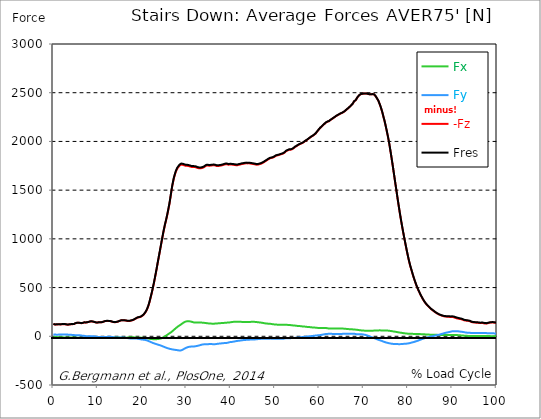
| Category |  Fx |  Fy |  -Fz |  Fres |
|---|---|---|---|---|
| 0.0 | -7.399 | 18.491 | 125.871 | 127.527 |
| 0.167348456675344 | -7.666 | 18.652 | 123.173 | 124.894 |
| 0.334696913350688 | -7.69 | 17.957 | 120.443 | 122.099 |
| 0.5020453700260321 | -7.634 | 16.802 | 119.126 | 120.645 |
| 0.669393826701376 | -8.07 | 16.592 | 120.847 | 122.357 |
| 0.83674228337672 | -8.45 | 16.576 | 121.953 | 123.48 |
| 1.0040907400520642 | -8.74 | 16.851 | 122.212 | 123.787 |
| 1.1621420602454444 | -9.055 | 17.182 | 122.349 | 123.981 |
| 1.3294905169207885 | -9.338 | 17.432 | 122.26 | 123.933 |
| 1.4968389735961325 | -9.589 | 17.578 | 122.067 | 123.771 |
| 1.6641874302714765 | -9.791 | 17.545 | 122.147 | 123.836 |
| 1.8315358869468206 | -10.049 | 17.691 | 122.777 | 124.482 |
| 1.9988843436221646 | -10.348 | 17.933 | 123.585 | 125.338 |
| 2.1662328002975086 | -10.768 | 18.442 | 124.118 | 125.976 |
| 2.333581256972853 | -11.293 | 18.935 | 124.353 | 126.332 |
| 2.5009297136481967 | -11.729 | 19.258 | 123.892 | 125.976 |
| 2.6682781703235405 | -11.867 | 19.088 | 123.311 | 125.395 |
| 2.8356266269988843 | -11.915 | 18.83 | 121.711 | 123.795 |
| 3.002975083674229 | -11.939 | 18.555 | 119.902 | 121.986 |
| 3.1703235403495724 | -11.858 | 17.553 | 119.352 | 121.291 |
| 3.337671997024917 | -11.834 | 16.649 | 119.086 | 120.919 |
| 3.4957233172182973 | -11.98 | 15.922 | 120.596 | 122.341 |
| 3.663071773893641 | -12.157 | 15.582 | 121.905 | 123.617 |
| 3.8304202305689854 | -12.295 | 15.235 | 122.697 | 124.369 |
| 3.997768687244329 | -12.416 | 14.807 | 123.278 | 124.886 |
| 4.165117143919673 | -12.537 | 14.379 | 123.9 | 125.443 |
| 4.332465600595017 | -12.634 | 13.838 | 124.474 | 125.936 |
| 4.499814057270361 | -12.682 | 12.981 | 124.805 | 126.154 |
| 4.667162513945706 | -12.707 | 12.085 | 125.661 | 126.905 |
| 4.834510970621049 | -12.909 | 11.479 | 129.805 | 130.993 |
| 5.001859427296393 | -13.409 | 11.527 | 133.747 | 134.943 |
| 5.169207883971737 | -13.935 | 11.762 | 135.791 | 137.051 |
| 5.336556340647081 | -14.338 | 11.616 | 137.738 | 139.006 |
| 5.503904797322425 | -14.758 | 11.39 | 138.78 | 140.064 |
| 5.671253253997769 | -15.09 | 11.043 | 138.796 | 140.089 |
| 5.82930457419115 | -15.324 | 10.582 | 137.835 | 139.127 |
| 5.996653030866494 | -15.469 | 9.976 | 136.558 | 137.827 |
| 6.164001487541838 | -15.429 | 8.894 | 135.476 | 136.688 |
| 6.331349944217181 | -15.275 | 7.601 | 134.143 | 135.266 |
| 6.498698400892526 | -15.235 | 6.487 | 135.516 | 136.575 |
| 6.66604685756787 | -15.227 | 5.412 | 137.471 | 138.481 |
| 6.833395314243213 | -15.38 | 4.629 | 139.838 | 140.816 |
| 7.000743770918558 | -15.825 | 4.354 | 142.439 | 143.433 |
| 7.168092227593902 | -15.696 | 3.07 | 141.938 | 142.883 |
| 7.335440684269246 | -15.308 | 1.252 | 141.446 | 142.318 |
| 7.50278914094459 | -14.977 | -0.347 | 141.656 | 142.472 |
| 7.6701375976199335 | -14.92 | -1.115 | 143.95 | 144.75 |
| 7.837486054295278 | -15.332 | -0.864 | 146.688 | 147.52 |
| 7.995537374488658 | -15.744 | -0.654 | 147.884 | 148.748 |
| 8.162885831164003 | -16.229 | -0.412 | 149.669 | 150.574 |
| 8.330234287839346 | -16.73 | -0.202 | 152.181 | 153.126 |
| 8.49758274451469 | -17.133 | -0.121 | 152.553 | 153.53 |
| 8.664931201190035 | -17.521 | 0.089 | 152.521 | 153.538 |
| 8.832279657865378 | -17.61 | -0.024 | 151.567 | 152.609 |
| 8.999628114540721 | -17.489 | -0.275 | 150.016 | 151.058 |
| 9.166976571216066 | -17.198 | -0.63 | 147.932 | 148.958 |
| 9.334325027891412 | -16.471 | -1.422 | 145.323 | 146.3 |
| 9.501673484566755 | -15.461 | -2.577 | 142.698 | 143.602 |
| 9.669021941242098 | -14.443 | -3.902 | 140.945 | 141.801 |
| 9.836370397917442 | -13.409 | -5.065 | 140.387 | 141.187 |
| 10.003718854592787 | -12.553 | -5.962 | 141.098 | 141.85 |
| 10.17106731126813 | -11.939 | -6.656 | 142.14 | 142.859 |
| 10.329118631461512 | -11.778 | -6.81 | 144.338 | 145.032 |
| 10.496467088136853 | -12.182 | -6.147 | 145.153 | 145.856 |
| 10.663815544812199 | -12.125 | -6.438 | 144.354 | 145.073 |
| 10.831164001487544 | -11.77 | -7.44 | 143.611 | 144.354 |
| 10.998512458162887 | -11.608 | -8.03 | 144.677 | 145.444 |
| 11.16586091483823 | -11.673 | -8.215 | 147.141 | 147.908 |
| 11.333209371513574 | -12.036 | -7.965 | 150.186 | 150.945 |
| 11.50055782818892 | -12.44 | -7.698 | 153.005 | 153.765 |
| 11.667906284864264 | -13.102 | -7.125 | 155.55 | 156.325 |
| 11.835254741539607 | -13.757 | -6.592 | 157.173 | 157.965 |
| 12.00260319821495 | -14.322 | -6.204 | 157.723 | 158.547 |
| 12.169951654890292 | -14.847 | -5.889 | 158.143 | 158.999 |
| 12.337300111565641 | -15.179 | -5.792 | 157.771 | 158.652 |
| 12.504648568240984 | -15.364 | -5.84 | 157.012 | 157.925 |
| 12.662699888434362 | -15.526 | -5.848 | 156.333 | 157.262 |
| 12.830048345109708 | -15.663 | -5.865 | 155.631 | 156.568 |
| 12.997396801785053 | -15.38 | -6.333 | 154.015 | 154.952 |
| 13.164745258460396 | -14.96 | -7.044 | 151.438 | 152.391 |
| 13.33209371513574 | -14.379 | -8.094 | 148.514 | 149.491 |
| 13.499442171811083 | -13.611 | -9.354 | 146.414 | 147.423 |
| 13.666790628486426 | -12.796 | -10.461 | 145.032 | 146.066 |
| 13.834139085161771 | -12.141 | -11.438 | 144.394 | 145.452 |
| 14.001487541837117 | -11.794 | -12.287 | 144.992 | 146.074 |
| 14.16883599851246 | -11.584 | -13.03 | 145.985 | 147.1 |
| 14.336184455187803 | -11.64 | -13.482 | 147.561 | 148.7 |
| 14.503532911863147 | -11.899 | -13.757 | 149.669 | 150.832 |
| 14.670881368538492 | -12.343 | -13.781 | 152.319 | 153.49 |
| 14.828932688731873 | -12.909 | -13.579 | 155.534 | 156.705 |
| 14.996281145407215 | -13.725 | -13.288 | 158.676 | 159.863 |
| 15.163629602082558 | -14.637 | -13.038 | 161.786 | 162.998 |
| 15.330978058757903 | -15.3 | -12.909 | 163.919 | 165.163 |
| 15.498326515433247 | -15.865 | -12.949 | 164.638 | 165.93 |
| 15.665674972108594 | -16.035 | -13.094 | 164.444 | 165.777 |
| 15.833023428783937 | -16.027 | -13.377 | 164.436 | 165.785 |
| 16.00037188545928 | -15.938 | -13.789 | 163.846 | 165.219 |
| 16.167720342134626 | -15.599 | -14.516 | 162.666 | 164.088 |
| 16.335068798809967 | -15.09 | -15.437 | 161.301 | 162.788 |
| 16.502417255485312 | -14.347 | -16.6 | 159.758 | 161.309 |
| 16.669765712160658 | -13.458 | -17.893 | 158.272 | 159.912 |
| 16.837114168836 | -12.472 | -19.185 | 157.044 | 158.781 |
| 17.004462625511344 | -11.438 | -20.445 | 156.479 | 158.321 |
| 17.16251394570472 | -10.582 | -21.568 | 157.149 | 159.072 |
| 17.32986240238007 | -9.928 | -22.473 | 158.636 | 160.623 |
| 17.497210859055414 | -9.605 | -23.006 | 160.744 | 162.772 |
| 17.664559315730756 | -9.322 | -23.499 | 162.618 | 164.662 |
| 17.8319077724061 | -9.791 | -23.24 | 164.322 | 166.358 |
| 17.999256229081443 | -10.203 | -23.079 | 166.907 | 168.911 |
| 18.166604685756788 | -10.736 | -22.861 | 170.801 | 172.772 |
| 18.333953142432133 | -11.527 | -22.707 | 175.632 | 177.57 |
| 18.501301599107478 | -12.44 | -22.748 | 180.066 | 182.021 |
| 18.668650055782823 | -13.345 | -23.087 | 183.734 | 185.753 |
| 18.835998512458165 | -14.136 | -23.725 | 187.684 | 189.792 |
| 19.00334696913351 | -14.872 | -24.711 | 191.982 | 194.211 |
| 19.170695425808855 | -15.098 | -25.712 | 193.969 | 196.311 |
| 19.338043882484197 | -14.815 | -27.247 | 195.431 | 197.927 |
| 19.496095202677576 | -14.322 | -29.032 | 197.111 | 199.801 |
| 19.66344365935292 | -13.708 | -30.753 | 199.042 | 201.926 |
| 19.830792116028263 | -13.353 | -32.272 | 201.998 | 205.068 |
| 19.998140572703612 | -13.975 | -33.362 | 208.137 | 211.32 |
| 20.165489029378953 | -14.379 | -34.202 | 213.937 | 217.193 |
| 20.3328374860543 | -15.122 | -34.622 | 219.956 | 223.235 |
| 20.500185942729644 | -16.043 | -35.559 | 228.244 | 231.612 |
| 20.667534399404985 | -17.174 | -37.143 | 239.424 | 242.946 |
| 20.83488285608033 | -18.361 | -38.354 | 249.586 | 253.229 |
| 21.002231312755672 | -19.646 | -40.527 | 263.52 | 267.39 |
| 21.16957976943102 | -20.979 | -43.25 | 280.112 | 284.264 |
| 21.336928226106362 | -22.4 | -46.222 | 299.605 | 304.031 |
| 21.504276682781704 | -23.838 | -49.308 | 321.27 | 325.955 |
| 21.67162513945705 | -25.106 | -52.58 | 347.556 | 352.459 |
| 21.82967645965043 | -26.334 | -55.908 | 376.636 | 381.725 |
| 21.997024916325774 | -27.433 | -59.196 | 406.678 | 411.929 |
| 22.16437337300112 | -28.346 | -62.613 | 437.876 | 443.288 |
| 22.33172182967646 | -29.048 | -66.038 | 470.301 | 475.866 |
| 22.499070286351806 | -29.63 | -69.067 | 505.109 | 510.739 |
| 22.666418743027148 | -30.115 | -71.781 | 541.548 | 547.187 |
| 22.833767199702496 | -30.446 | -74.35 | 579.604 | 585.218 |
| 23.00111565637784 | -30.292 | -76.854 | 618.419 | 623.984 |
| 23.168464113053183 | -29.598 | -79.285 | 658.615 | 664.116 |
| 23.335812569728528 | -29.202 | -81.693 | 699.085 | 704.53 |
| 23.50316102640387 | -28.645 | -84.31 | 742.351 | 747.763 |
| 23.670509483079215 | -27.748 | -86.701 | 783.638 | 788.993 |
| 23.83785793975456 | -26.593 | -88.947 | 824.617 | 829.917 |
| 23.995909259947936 | -25.139 | -91.201 | 865.557 | 870.775 |
| 24.163257716623285 | -23.103 | -93.818 | 907.094 | 912.304 |
| 24.330606173298627 | -20.882 | -96.597 | 949.01 | 954.221 |
| 24.49795462997397 | -18.006 | -99.634 | 989.699 | 994.942 |
| 24.665303086649313 | -14.532 | -102.889 | 1030.146 | 1035.453 |
| 24.83265154332466 | -10.849 | -106.185 | 1070.075 | 1075.455 |
| 25.0 | -6.495 | -109.126 | 1106.063 | 1111.531 |
| 25.167348456675345 | -1.785 | -112.219 | 1141.654 | 1147.252 |
| 25.334696913350694 | 3.296 | -115.224 | 1172.625 | 1178.361 |
| 25.502045370026035 | 8.555 | -118.157 | 1204.711 | 1210.584 |
| 25.669393826701377 | 14.015 | -120.863 | 1239.454 | 1245.465 |
| 25.836742283376722 | 19.444 | -123.399 | 1276.742 | 1282.898 |
| 26.004090740052067 | 24.662 | -125.54 | 1315.056 | 1321.325 |
| 26.17143919672741 | 29.767 | -127.438 | 1353.403 | 1359.768 |
| 26.329490516920792 | 34.461 | -129.66 | 1399.964 | 1406.443 |
| 26.49683897359613 | 39.574 | -131.752 | 1449.41 | 1455.969 |
| 26.66418743027148 | 45.124 | -132.964 | 1498.734 | 1505.358 |
| 26.831535886946828 | 51.336 | -134.305 | 1544.31 | 1551.063 |
| 26.998884343622166 | 58.283 | -136.098 | 1581.67 | 1588.65 |
| 27.166232800297514 | 64.931 | -137.358 | 1618.183 | 1625.372 |
| 27.333581256972852 | 71.66 | -138.344 | 1645.592 | 1653.031 |
| 27.5009297136482 | 78.26 | -139.313 | 1671.368 | 1679.067 |
| 27.668278170323543 | 84.665 | -140.347 | 1693.389 | 1701.37 |
| 27.835626626998888 | 90.805 | -141.559 | 1710.337 | 1718.665 |
| 28.002975083674233 | 96.968 | -142.657 | 1724.651 | 1733.335 |
| 28.170323540349575 | 103.051 | -143.861 | 1735.516 | 1744.587 |
| 28.33767199702492 | 107.938 | -145.121 | 1744.151 | 1753.578 |
| 28.50502045370026 | 112.397 | -146.147 | 1753.457 | 1763.183 |
| 28.663071773893645 | 117.349 | -146.317 | 1760.186 | 1770.211 |
| 28.830420230568986 | 122.874 | -144.774 | 1762.601 | 1772.86 |
| 28.99776868724433 | 128.335 | -141.688 | 1763.102 | 1773.515 |
| 29.165117143919673 | 134.208 | -137.52 | 1760.291 | 1770.825 |
| 29.33246560059502 | 139.386 | -133.36 | 1757.803 | 1768.442 |
| 29.499814057270367 | 144.144 | -128.9 | 1755.549 | 1766.253 |
| 29.66716251394571 | 147.94 | -124.53 | 1753.409 | 1764.128 |
| 29.834510970621054 | 151.034 | -120.701 | 1750.242 | 1760.986 |
| 30.00185942729639 | 152.868 | -117.195 | 1750.137 | 1760.808 |
| 30.169207883971744 | 154.063 | -113.795 | 1749.951 | 1760.517 |
| 30.33655634064708 | 154.532 | -111.444 | 1749.838 | 1760.291 |
| 30.50390479732243 | 154.443 | -109.594 | 1747.261 | 1757.609 |
| 30.671253253997772 | 153.732 | -107.882 | 1746.033 | 1756.22 |
| 30.829304574191156 | 152.868 | -106.444 | 1743.077 | 1753.118 |
| 30.996653030866494 | 151.519 | -105.983 | 1739.854 | 1749.757 |
| 31.164001487541842 | 149.596 | -105.983 | 1738.117 | 1747.859 |
| 31.331349944217187 | 147.092 | -105.676 | 1737.77 | 1747.277 |
| 31.498698400892525 | 144.451 | -105.579 | 1738.303 | 1747.584 |
| 31.666046857567874 | 142.641 | -104.99 | 1738.553 | 1747.649 |
| 31.833395314243212 | 141.841 | -103.907 | 1737.091 | 1746.074 |
| 32.00074377091856 | 141.438 | -102.526 | 1737.156 | 1746.033 |
| 32.1680922275939 | 141.179 | -101.217 | 1734.635 | 1743.44 |
| 32.33544068426925 | 141.906 | -99.852 | 1731.194 | 1739.983 |
| 32.50278914094459 | 142.253 | -98.325 | 1728.141 | 1736.889 |
| 32.670137597619934 | 142.318 | -96.613 | 1725.806 | 1734.482 |
| 32.83748605429528 | 142.06 | -94.601 | 1724.909 | 1733.472 |
| 33.004834510970625 | 141.801 | -92.598 | 1724.013 | 1732.462 |
| 33.162885831164004 | 141.341 | -90.272 | 1724.061 | 1732.382 |
| 33.33023428783935 | 140.864 | -87.848 | 1725.152 | 1733.319 |
| 33.497582744514695 | 140.355 | -85.659 | 1726.678 | 1734.732 |
| 33.664931201190036 | 139.83 | -83.672 | 1728.577 | 1736.517 |
| 33.83227965786538 | 139.127 | -82.896 | 1732.293 | 1740.144 |
| 33.99962811454073 | 138.077 | -82.654 | 1736.154 | 1743.909 |
| 34.16697657121607 | 137.197 | -82.404 | 1741.477 | 1749.135 |
| 34.33432502789141 | 136.324 | -82.153 | 1746.809 | 1754.37 |
| 34.50167348456676 | 135.379 | -82.064 | 1751.809 | 1759.273 |
| 34.6690219412421 | 133.949 | -81.628 | 1754.499 | 1761.826 |
| 34.83637039791744 | 132.713 | -81.458 | 1753.554 | 1760.784 |
| 35.00371885459279 | 132.18 | -80.554 | 1751.026 | 1758.191 |
| 35.17106731126814 | 131.647 | -80.004 | 1750.42 | 1757.512 |
| 35.338415767943474 | 131.162 | -79.689 | 1750.646 | 1757.69 |
| 35.49646708813686 | 130.573 | -79.891 | 1752.463 | 1759.459 |
| 35.6638155448122 | 129.999 | -80.239 | 1753.61 | 1760.574 |
| 35.831164001487544 | 129.482 | -80.538 | 1754.305 | 1761.244 |
| 35.998512458162885 | 129.224 | -80.707 | 1755.42 | 1762.343 |
| 36.165860914838234 | 129.45 | -80.861 | 1756.155 | 1763.094 |
| 36.333209371513576 | 129.765 | -80.901 | 1755.864 | 1762.827 |
| 36.50055782818892 | 130.274 | -80.78 | 1753.724 | 1760.727 |
| 36.667906284864266 | 130.847 | -80.295 | 1750.605 | 1757.641 |
| 36.83525474153961 | 131.413 | -78.833 | 1748.416 | 1755.42 |
| 37.002603198214956 | 132.067 | -77.452 | 1747.463 | 1754.426 |
| 37.1699516548903 | 132.867 | -76.604 | 1747.681 | 1754.644 |
| 37.337300111565646 | 133.561 | -75.545 | 1749.458 | 1756.397 |
| 37.50464856824098 | 134.151 | -74.802 | 1750.258 | 1757.189 |
| 37.66269988843437 | 134.717 | -73.978 | 1751.526 | 1758.441 |
| 37.83004834510971 | 135.282 | -73.114 | 1752.997 | 1759.895 |
| 37.99739680178505 | 135.864 | -72.241 | 1754.653 | 1761.535 |
| 38.16474525846039 | 136.453 | -71.361 | 1756.438 | 1763.304 |
| 38.33209371513574 | 136.946 | -70.545 | 1758.74 | 1765.59 |
| 38.49944217181109 | 137.318 | -69.883 | 1761.769 | 1768.603 |
| 38.666790628486424 | 137.98 | -69.56 | 1763.773 | 1770.639 |
| 38.83413908516178 | 138.772 | -69.301 | 1765.356 | 1772.271 |
| 39.001487541837115 | 139.418 | -68.768 | 1767.004 | 1773.943 |
| 39.16883599851246 | 140.202 | -67.71 | 1765.76 | 1772.731 |
| 39.336184455187805 | 140.824 | -66.361 | 1762.521 | 1769.492 |
| 39.503532911863154 | 141.575 | -63.832 | 1761.139 | 1768.102 |
| 39.670881368538495 | 141.995 | -61.15 | 1763.021 | 1769.936 |
| 39.83822982521384 | 142.625 | -59.583 | 1763.361 | 1770.292 |
| 39.996281145407224 | 143.716 | -58.897 | 1762.908 | 1769.92 |
| 40.163629602082565 | 145.153 | -58.347 | 1762.472 | 1769.597 |
| 40.33097805875791 | 146.745 | -57.653 | 1762.125 | 1769.371 |
| 40.498326515433256 | 147.625 | -55.875 | 1761.39 | 1768.668 |
| 40.6656749721086 | 148.272 | -54.535 | 1760.606 | 1767.909 |
| 40.83302342878393 | 148.837 | -53.323 | 1758.57 | 1765.889 |
| 41.00037188545929 | 148.95 | -51.877 | 1757.262 | 1764.548 |
| 41.16772034213463 | 149.168 | -50.366 | 1756.51 | 1763.781 |
| 41.33506879880997 | 149.402 | -48.84 | 1755.832 | 1763.086 |
| 41.50241725548531 | 149.516 | -47.499 | 1755.509 | 1762.747 |
| 41.66976571216066 | 149.54 | -46.457 | 1756.963 | 1764.168 |
| 41.837114168836 | 149.701 | -46.028 | 1760.646 | 1767.828 |
| 42.004462625511344 | 149.483 | -44.825 | 1762.464 | 1769.581 |
| 42.17181108218669 | 148.821 | -43.524 | 1763.118 | 1770.138 |
| 42.32986240238007 | 148.409 | -42.555 | 1766.01 | 1772.941 |
| 42.497210859055414 | 147.924 | -41.529 | 1768.522 | 1775.365 |
| 42.66455931573076 | 147.052 | -40.204 | 1769.144 | 1775.881 |
| 42.831907772406105 | 146.397 | -39.073 | 1770.235 | 1776.891 |
| 42.999256229081446 | 146.107 | -38.298 | 1771.948 | 1778.555 |
| 43.16660468575679 | 145.848 | -37.757 | 1773.466 | 1780.034 |
| 43.33395314243214 | 145.582 | -37.256 | 1775.074 | 1781.609 |
| 43.50130159910748 | 145.703 | -37.021 | 1775.995 | 1782.538 |
| 43.66865005578282 | 145.985 | -36.343 | 1775.324 | 1781.883 |
| 43.83599851245817 | 146.187 | -36.052 | 1774.516 | 1781.092 |
| 44.00334696913351 | 146.478 | -35.705 | 1774.848 | 1781.447 |
| 44.17069542580886 | 146.632 | -34.937 | 1775.373 | 1781.972 |
| 44.3380438824842 | 147.044 | -34.202 | 1774.969 | 1781.593 |
| 44.49609520267758 | 147.956 | -34.008 | 1772.626 | 1779.339 |
| 44.66344365935292 | 148.433 | -33.637 | 1770.049 | 1776.802 |
| 44.83079211602827 | 148.441 | -32.869 | 1770.388 | 1777.15 |
| 44.99814057270361 | 148.675 | -32.934 | 1769.5 | 1776.302 |
| 45.16548902937895 | 148.756 | -32.974 | 1767.343 | 1774.169 |
| 45.332837486054295 | 148.417 | -32.918 | 1765.744 | 1772.553 |
| 45.500185942729644 | 147.65 | -32.078 | 1764.411 | 1771.14 |
| 45.66753439940499 | 146.866 | -31.335 | 1762.989 | 1769.645 |
| 45.83488285608033 | 146.074 | -30.688 | 1761.535 | 1768.119 |
| 46.00223131275568 | 145.129 | -29.703 | 1761.398 | 1767.892 |
| 46.16957976943102 | 144.176 | -28.604 | 1762.125 | 1768.522 |
| 46.336928226106366 | 143.263 | -27.457 | 1764.524 | 1770.841 |
| 46.50427668278171 | 142.35 | -26.972 | 1766.818 | 1773.062 |
| 46.671625139457056 | 141.462 | -26.762 | 1769.007 | 1775.195 |
| 46.829676459650436 | 140.387 | -26.544 | 1771.107 | 1777.206 |
| 46.99702491632577 | 139.265 | -26.342 | 1774.331 | 1780.332 |
| 47.16437337300112 | 138.029 | -26.1 | 1778.402 | 1784.299 |
| 47.33172182967646 | 136.68 | -25.833 | 1782.522 | 1788.305 |
| 47.49907028635181 | 135.153 | -25.833 | 1786.956 | 1792.627 |
| 47.66641874302716 | 133.561 | -25.648 | 1792.546 | 1798.096 |
| 47.83376719970249 | 132.285 | -25.333 | 1797.401 | 1802.854 |
| 48.001115656377834 | 131.38 | -25.026 | 1802.119 | 1807.483 |
| 48.16846411305319 | 130.645 | -24.888 | 1806.861 | 1812.152 |
| 48.33581256972853 | 129.886 | -24.719 | 1811.877 | 1817.087 |
| 48.50316102640387 | 129.329 | -24.589 | 1817.225 | 1822.362 |
| 48.67050948307921 | 128.868 | -24.379 | 1821.983 | 1827.056 |
| 48.837857939754564 | 128.456 | -24.08 | 1826.312 | 1831.321 |
| 49.005206396429905 | 127.592 | -23.911 | 1829.584 | 1834.512 |
| 49.163257716623285 | 126.558 | -24.186 | 1830.19 | 1835.053 |
| 49.33060617329863 | 125.209 | -24.654 | 1831.797 | 1836.58 |
| 49.49795462997397 | 123.908 | -25.123 | 1834.027 | 1838.728 |
| 49.66530308664932 | 122.68 | -25.591 | 1837.105 | 1841.733 |
| 49.832651543324666 | 121.84 | -25.712 | 1841.515 | 1846.087 |
| 50.0 | 121.17 | -25.607 | 1846.814 | 1851.33 |
| 50.16734845667534 | 120.516 | -25.494 | 1852.041 | 1856.5 |
| 50.33469691335069 | 119.966 | -25.769 | 1854.27 | 1858.705 |
| 50.50204537002604 | 119.417 | -26.052 | 1856.508 | 1860.919 |
| 50.66939382670139 | 119.021 | -26.157 | 1858.479 | 1862.865 |
| 50.836742283376715 | 118.69 | -26.1 | 1860.563 | 1864.933 |
| 51.00409074005207 | 118.318 | -26.027 | 1862.954 | 1867.284 |
| 51.17143919672741 | 118.197 | -25.93 | 1865.337 | 1869.659 |
| 51.32949051692079 | 118.278 | -25.963 | 1867.979 | 1872.3 |
| 51.496838973596134 | 118.464 | -26.084 | 1870.709 | 1875.031 |
| 51.66418743027148 | 118.884 | -26.213 | 1872.583 | 1876.937 |
| 51.831535886946824 | 119.094 | -25.793 | 1875.774 | 1880.12 |
| 51.99888434362217 | 118.843 | -24.242 | 1880.637 | 1884.951 |
| 52.16623280029752 | 118.326 | -22.885 | 1885.354 | 1889.62 |
| 52.33358125697285 | 117.777 | -21.261 | 1893.384 | 1897.601 |
| 52.5009297136482 | 117.349 | -20.098 | 1900.258 | 1904.451 |
| 52.668278170323546 | 117.3 | -20.025 | 1903.942 | 1908.126 |
| 52.835626626998895 | 117.292 | -20.025 | 1907.682 | 1911.866 |
| 53.00297508367424 | 116.872 | -20.001 | 1911.471 | 1915.631 |
| 53.17032354034958 | 116.388 | -20.001 | 1914.532 | 1918.66 |
| 53.33767199702492 | 115.645 | -19.977 | 1914.249 | 1918.337 |
| 53.50502045370027 | 114.837 | -19.468 | 1914.896 | 1918.927 |
| 53.663071773893655 | 113.827 | -18.668 | 1917.222 | 1921.18 |
| 53.83042023056899 | 112.607 | -18.192 | 1920.203 | 1924.088 |
| 53.99776868724433 | 111.727 | -17.497 | 1924.71 | 1928.547 |
| 54.16511714391967 | 110.887 | -16.697 | 1929.089 | 1932.877 |
| 54.33246560059503 | 110.37 | -16.713 | 1937.272 | 1941.044 |
| 54.49981405727037 | 109.861 | -16.431 | 1942.587 | 1946.319 |
| 54.667162513945705 | 109.134 | -15.792 | 1946.367 | 1950.035 |
| 54.834510970621054 | 107.882 | -14.645 | 1951.012 | 1954.575 |
| 55.0018594272964 | 106.734 | -13.91 | 1957.006 | 1960.496 |
| 55.169207883971744 | 106.508 | -12.989 | 1961.005 | 1964.47 |
| 55.336556340647086 | 106.161 | -12.214 | 1965.706 | 1969.139 |
| 55.50390479732243 | 105.28 | -11.212 | 1970.157 | 1973.518 |
| 55.671253253997776 | 104.424 | -10.364 | 1973.76 | 1977.048 |
| 55.83860171067312 | 103.447 | -9.75 | 1976.991 | 1980.206 |
| 55.9966530308665 | 102.138 | -8.886 | 1980.263 | 1983.437 |
| 56.16400148754184 | 101.282 | -7.803 | 1983.51 | 1986.644 |
| 56.33134994421718 | 100.943 | -6.769 | 1987.404 | 1990.514 |
| 56.498698400892536 | 100.393 | -6.196 | 1992.703 | 1995.772 |
| 56.66604685756788 | 99.763 | -5.808 | 1998.592 | 2001.613 |
| 56.83339531424321 | 98.85 | -5.17 | 2005.022 | 2007.994 |
| 57.00074377091856 | 97.631 | -4.289 | 2009.65 | 2012.575 |
| 57.16809222759391 | 96.54 | -3.352 | 2014.045 | 2016.921 |
| 57.33544068426925 | 95.781 | -2.302 | 2019.255 | 2022.107 |
| 57.5027891409446 | 95.199 | -1.187 | 2025.249 | 2028.084 |
| 57.670137597619934 | 94.617 | -0.315 | 2031.299 | 2034.111 |
| 57.83748605429528 | 94.23 | 0.275 | 2036.582 | 2039.386 |
| 58.004834510970625 | 93.567 | 0.727 | 2042.415 | 2045.177 |
| 58.16288583116401 | 92.388 | 1.47 | 2047.835 | 2050.541 |
| 58.330234287839346 | 91.265 | 2.27 | 2052.795 | 2055.461 |
| 58.497582744514695 | 90.506 | 3.304 | 2057.012 | 2059.645 |
| 58.66493120119004 | 90.255 | 4.572 | 2061.616 | 2064.242 |
| 58.832279657865385 | 89.9 | 5.994 | 2068.062 | 2070.688 |
| 58.999628114540734 | 89.278 | 6.705 | 2073.959 | 2076.569 |
| 59.16697657121607 | 88.438 | 7.383 | 2080.939 | 2083.508 |
| 59.33432502789142 | 87.606 | 8.328 | 2090.867 | 2093.403 |
| 59.50167348456676 | 86.758 | 9.177 | 2100.657 | 2103.153 |
| 59.66902194124211 | 85.958 | 9.839 | 2109.866 | 2112.33 |
| 59.83637039791745 | 85.231 | 10.598 | 2119.269 | 2121.716 |
| 60.00371885459278 | 84.496 | 11.35 | 2128.68 | 2131.111 |
| 60.17106731126813 | 84.205 | 12.392 | 2137.477 | 2139.9 |
| 60.33841576794349 | 83.858 | 13.458 | 2143.89 | 2146.298 |
| 60.49646708813685 | 84.084 | 14.872 | 2151.435 | 2153.843 |
| 60.6638155448122 | 84.391 | 16.471 | 2158.592 | 2161.016 |
| 60.831164001487544 | 84.657 | 18.087 | 2165.717 | 2168.157 |
| 60.99851245816289 | 84.843 | 19.621 | 2172.963 | 2175.419 |
| 61.16586091483824 | 84.851 | 20.962 | 2180.468 | 2182.931 |
| 61.333209371513576 | 84.682 | 22.061 | 2187.786 | 2190.242 |
| 61.50055782818892 | 84.213 | 22.828 | 2193.885 | 2196.309 |
| 61.667906284864266 | 83.72 | 23.547 | 2199.209 | 2201.6 |
| 61.835254741539615 | 82.638 | 24.153 | 2202.472 | 2204.79 |
| 62.002603198214956 | 80.95 | 25.171 | 2204.362 | 2206.56 |
| 62.16995165489029 | 79.552 | 25.938 | 2207.367 | 2209.451 |
| 62.33730011156564 | 78.995 | 25.955 | 2213.038 | 2215.09 |
| 62.504648568240995 | 78.526 | 25.688 | 2219.816 | 2221.827 |
| 62.67199702491633 | 78.663 | 25.583 | 2224.767 | 2226.779 |
| 62.83004834510971 | 79.051 | 25.114 | 2229.776 | 2231.787 |
| 62.99739680178505 | 79.269 | 24.121 | 2235.471 | 2237.466 |
| 63.1647452584604 | 79.584 | 23.426 | 2240.398 | 2242.394 |
| 63.33209371513575 | 79.35 | 23.143 | 2246.134 | 2248.097 |
| 63.4994421718111 | 79.189 | 23.313 | 2250.609 | 2252.539 |
| 63.666790628486424 | 79.132 | 23.41 | 2256.845 | 2258.76 |
| 63.83413908516177 | 79.592 | 23.959 | 2261.918 | 2263.841 |
| 64.00148754183712 | 80.368 | 24.404 | 2266.902 | 2268.857 |
| 64.16883599851248 | 80.788 | 24.767 | 2270.513 | 2272.468 |
| 64.3361844551878 | 80.836 | 24.775 | 2274.18 | 2276.135 |
| 64.50353291186315 | 80.15 | 23.887 | 2279.003 | 2280.926 |
| 64.6708813685385 | 79.899 | 23.838 | 2283.244 | 2285.158 |
| 64.83822982521384 | 79.665 | 23.87 | 2287.444 | 2289.351 |
| 65.00557828188919 | 79.132 | 23.677 | 2291.702 | 2293.584 |
| 65.16362960208257 | 79.043 | 24.597 | 2293.947 | 2295.805 |
| 65.3309780587579 | 78.93 | 25.502 | 2297.437 | 2299.279 |
| 65.49832651543326 | 78.381 | 25.51 | 2302.534 | 2304.344 |
| 65.6656749721086 | 78.05 | 25.817 | 2308.253 | 2310.047 |
| 65.83302342878395 | 77.347 | 26.181 | 2313.73 | 2315.483 |
| 66.00037188545929 | 76.337 | 26.811 | 2321.485 | 2323.181 |
| 66.16772034213463 | 75.432 | 26.989 | 2328.263 | 2329.902 |
| 66.33506879880998 | 74.657 | 26.601 | 2333.796 | 2335.403 |
| 66.50241725548531 | 73.889 | 26.221 | 2339.887 | 2341.446 |
| 66.66976571216065 | 73.292 | 26.076 | 2347.02 | 2348.554 |
| 66.83711416883601 | 72.96 | 26.237 | 2353.902 | 2355.413 |
| 67.00446262551135 | 72.565 | 26.447 | 2360.978 | 2362.465 |
| 67.1718110821867 | 72.104 | 26.56 | 2369.097 | 2370.567 |
| 67.32986240238007 | 71.523 | 25.809 | 2375.115 | 2376.561 |
| 67.49721085905541 | 70.957 | 25.567 | 2384.922 | 2386.343 |
| 67.66455931573076 | 70.416 | 25.583 | 2396.53 | 2397.927 |
| 67.83190777240611 | 69.681 | 25.841 | 2411.11 | 2412.476 |
| 67.99925622908145 | 69.035 | 24.832 | 2419.495 | 2420.836 |
| 68.16660468575678 | 68.469 | 22.538 | 2421.547 | 2422.88 |
| 68.33395314243214 | 67.58 | 21.875 | 2431.911 | 2433.212 |
| 68.50130159910749 | 66.571 | 21.843 | 2445.385 | 2446.654 |
| 68.66865005578282 | 65.65 | 21.843 | 2457.139 | 2458.391 |
| 68.83599851245816 | 64.398 | 21.811 | 2466.445 | 2467.681 |
| 69.00334696913352 | 62.936 | 21.778 | 2473.941 | 2475.153 |
| 69.17069542580886 | 61.708 | 22.029 | 2480.751 | 2481.946 |
| 69.3380438824842 | 61.021 | 21.496 | 2484.442 | 2485.63 |
| 69.50539233915956 | 60.431 | 20.631 | 2486.284 | 2487.455 |
| 69.66344365935292 | 59.656 | 19.912 | 2488.304 | 2489.467 |
| 69.83079211602826 | 58.88 | 19.185 | 2490.331 | 2491.478 |
| 69.99814057270362 | 58.59 | 17.747 | 2490.275 | 2491.422 |
| 70.16548902937896 | 57.992 | 16.366 | 2490.945 | 2492.076 |
| 70.33283748605429 | 57.354 | 14.847 | 2491.357 | 2492.48 |
| 70.50018594272964 | 56.716 | 13.07 | 2491.179 | 2492.278 |
| 70.667534399405 | 56.102 | 10.76 | 2490.574 | 2491.664 |
| 70.83488285608033 | 55.682 | 7.997 | 2489.095 | 2490.162 |
| 71.00223131275568 | 55.52 | 5.089 | 2486.842 | 2487.908 |
| 71.16957976943102 | 56.433 | 1.947 | 2485.371 | 2486.446 |
| 71.33692822610637 | 56.901 | -1.341 | 2483.247 | 2484.329 |
| 71.50427668278171 | 57.144 | -4.709 | 2482.423 | 2483.513 |
| 71.67162513945706 | 57.556 | -7.981 | 2483.029 | 2484.119 |
| 71.8389735961324 | 57.499 | -10.574 | 2484.572 | 2485.654 |
| 71.99702491632577 | 57.685 | -12.892 | 2484.717 | 2485.8 |
| 72.16437337300113 | 57.903 | -15.203 | 2484.677 | 2485.751 |
| 72.33172182967647 | 58.315 | -17.764 | 2483.295 | 2484.378 |
| 72.49907028635181 | 58.687 | -20.68 | 2476.066 | 2477.164 |
| 72.66641874302715 | 58.889 | -23.628 | 2466.509 | 2467.624 |
| 72.8337671997025 | 59.212 | -26.69 | 2454.538 | 2455.677 |
| 73.00111565637783 | 59.559 | -29.856 | 2442.162 | 2443.342 |
| 73.16846411305319 | 60.028 | -32.999 | 2429.181 | 2430.401 |
| 73.33581256972853 | 60.617 | -35.907 | 2415.779 | 2417.056 |
| 73.50316102640387 | 60.851 | -38.661 | 2396.352 | 2397.677 |
| 73.67050948307921 | 60.738 | -41.206 | 2376.601 | 2377.966 |
| 73.83785793975457 | 60.674 | -43.823 | 2355.098 | 2356.511 |
| 74.00520639642991 | 60.536 | -46.448 | 2330.953 | 2332.423 |
| 74.16325771662328 | 60.674 | -49.26 | 2305.717 | 2307.252 |
| 74.33060617329863 | 60.658 | -52.111 | 2276.531 | 2278.139 |
| 74.49795462997398 | 60.561 | -54.987 | 2246.489 | 2248.169 |
| 74.66530308664932 | 60.609 | -57.822 | 2218.41 | 2220.179 |
| 74.83265154332466 | 60.27 | -60.343 | 2186.05 | 2187.891 |
| 75.00000000000001 | 59.85 | -62.693 | 2152.518 | 2154.44 |
| 75.16734845667534 | 59.43 | -64.818 | 2117.16 | 2119.156 |
| 75.3346969133507 | 58.84 | -66.918 | 2081.157 | 2083.225 |
| 75.50204537002605 | 58.153 | -68.824 | 2043.384 | 2045.533 |
| 75.66939382670138 | 57.41 | -70.844 | 2004.569 | 2006.791 |
| 75.83674228337672 | 56.392 | -72.443 | 1960.73 | 1963.016 |
| 76.00409074005208 | 55.165 | -73.809 | 1914.064 | 1916.422 |
| 76.17143919672742 | 53.848 | -75.117 | 1866.832 | 1869.263 |
| 76.33878765340276 | 52.636 | -76.394 | 1818.735 | 1821.239 |
| 76.49683897359614 | 51.424 | -77.613 | 1768.846 | 1771.422 |
| 76.66418743027148 | 50.1 | -78.453 | 1717.744 | 1720.386 |
| 76.83153588694682 | 48.791 | -79.043 | 1665.787 | 1668.501 |
| 76.99888434362218 | 47.717 | -79.415 | 1614.604 | 1617.383 |
| 77.16623280029752 | 46.594 | -79.73 | 1562.784 | 1565.628 |
| 77.33358125697285 | 45.164 | -79.916 | 1512.289 | 1515.189 |
| 77.5009297136482 | 43.75 | -80.061 | 1460.977 | 1463.942 |
| 77.66827817032356 | 42.207 | -80.303 | 1409.545 | 1412.574 |
| 77.83562662699889 | 40.721 | -80.489 | 1359.784 | 1362.886 |
| 78.00297508367423 | 39.348 | -80.748 | 1310.929 | 1314.119 |
| 78.17032354034959 | 38.144 | -80.788 | 1262.856 | 1266.128 |
| 78.33767199702493 | 37.021 | -80.424 | 1217.297 | 1220.633 |
| 78.50502045370027 | 35.729 | -79.883 | 1172.399 | 1175.776 |
| 78.67236891037561 | 34.525 | -79.221 | 1129.497 | 1132.922 |
| 78.83042023056899 | 33.297 | -78.583 | 1087.693 | 1091.167 |
| 78.99776868724433 | 32.175 | -77.92 | 1046.487 | 1050.001 |
| 79.16511714391969 | 31.076 | -77.282 | 1006.34 | 1009.902 |
| 79.33246560059503 | 30.066 | -76.644 | 967.816 | 971.435 |
| 79.49981405727036 | 29.137 | -76.079 | 929.381 | 933.064 |
| 79.66716251394571 | 28.241 | -75.448 | 891.43 | 895.179 |
| 79.83451097062107 | 27.401 | -74.6 | 854.603 | 858.408 |
| 80.00185942729641 | 26.69 | -73.494 | 819.06 | 822.905 |
| 80.16920788397174 | 26.229 | -72.072 | 785.084 | 788.953 |
| 80.33655634064709 | 25.947 | -70.392 | 753.378 | 757.247 |
| 80.50390479732243 | 25.753 | -68.558 | 723.812 | 727.657 |
| 80.67125325399778 | 25.623 | -66.563 | 696.597 | 700.394 |
| 80.83860171067312 | 25.349 | -64.503 | 672.178 | 675.894 |
| 80.99665303086651 | 25.018 | -62.556 | 645.52 | 649.188 |
| 81.16400148754184 | 24.654 | -60.561 | 619.76 | 623.354 |
| 81.3313499442172 | 24.355 | -58.509 | 596.341 | 599.855 |
| 81.49869840089255 | 24.202 | -56.11 | 573.246 | 576.639 |
| 81.66604685756786 | 24.089 | -53.63 | 551.21 | 554.489 |
| 81.83339531424322 | 23.887 | -51.182 | 530.094 | 533.252 |
| 82.00074377091858 | 23.636 | -48.694 | 509.842 | 512.864 |
| 82.16809222759392 | 23.289 | -46.303 | 491.723 | 494.615 |
| 82.33544068426926 | 22.998 | -43.662 | 474.509 | 477.248 |
| 82.50278914094459 | 22.804 | -40.681 | 457.715 | 460.284 |
| 82.67013759761994 | 22.562 | -37.781 | 441.939 | 444.354 |
| 82.83748605429528 | 22.206 | -34.84 | 426.663 | 428.957 |
| 83.00483451097062 | 21.633 | -31.375 | 411.614 | 413.876 |
| 83.17218296764597 | 21.302 | -28.669 | 397.372 | 399.537 |
| 83.33023428783935 | 21.011 | -26.092 | 383.519 | 385.667 |
| 83.4975827445147 | 20.623 | -23.378 | 370.618 | 372.799 |
| 83.66493120119004 | 20.187 | -20.954 | 358.744 | 360.925 |
| 83.83227965786537 | 19.694 | -18.353 | 347.434 | 349.615 |
| 83.99962811454073 | 19.226 | -15.954 | 337.127 | 339.332 |
| 84.16697657121607 | 18.806 | -13.935 | 327.983 | 330.196 |
| 84.33432502789142 | 18.305 | -11.955 | 319.396 | 321.641 |
| 84.50167348456677 | 17.852 | -10.089 | 311.245 | 313.499 |
| 84.6690219412421 | 17.392 | -8.272 | 303.724 | 306.018 |
| 84.83637039791745 | 16.996 | -6.398 | 296.131 | 298.466 |
| 85.0037188545928 | 16.633 | -4.54 | 288.812 | 291.22 |
| 85.17106731126813 | 16.269 | -2.763 | 282.108 | 284.523 |
| 85.33841576794349 | 15.978 | -0.986 | 275.435 | 277.826 |
| 85.50576422461883 | 15.663 | 0.679 | 269.417 | 271.792 |
| 85.66381554481221 | 15.364 | 2.213 | 264.166 | 266.533 |
| 85.83116400148755 | 15.227 | 3.982 | 258.156 | 260.499 |
| 85.99851245816289 | 15.09 | 5.84 | 252.348 | 254.675 |
| 86.16586091483823 | 14.969 | 7.795 | 246.871 | 249.198 |
| 86.33320937151358 | 14.936 | 9.904 | 241.249 | 243.568 |
| 86.50055782818893 | 14.742 | 11.479 | 236.532 | 238.874 |
| 86.66790628486427 | 14.516 | 12.658 | 232.145 | 234.496 |
| 86.83525474153961 | 14.347 | 14.04 | 227.937 | 230.295 |
| 87.00260319821496 | 14.225 | 16.011 | 224.027 | 226.491 |
| 87.16995165489031 | 14.128 | 18.087 | 220.424 | 223.025 |
| 87.33730011156564 | 14.023 | 20.324 | 216.975 | 219.729 |
| 87.504648568241 | 13.894 | 22.554 | 213.865 | 216.813 |
| 87.67199702491634 | 13.765 | 24.581 | 211.474 | 214.616 |
| 87.83004834510972 | 13.603 | 26.924 | 209.002 | 212.37 |
| 87.99739680178506 | 13.514 | 29.331 | 206.829 | 210.424 |
| 88.1647452584604 | 13.442 | 31.73 | 204.898 | 208.711 |
| 88.33209371513574 | 13.345 | 34.081 | 203.283 | 207.362 |
| 88.49944217181108 | 13.361 | 36.028 | 202.596 | 206.958 |
| 88.66679062848644 | 13.466 | 37.603 | 201.861 | 206.465 |
| 88.83413908516178 | 13.603 | 39.17 | 201.158 | 206.029 |
| 89.00148754183712 | 13.878 | 40.794 | 200.649 | 205.859 |
| 89.16883599851246 | 14.153 | 42.361 | 199.833 | 205.391 |
| 89.33618445518782 | 14.145 | 44.179 | 199.082 | 205.019 |
| 89.50353291186315 | 14.015 | 46.465 | 198.517 | 204.842 |
| 89.6708813685385 | 13.628 | 47.668 | 197.58 | 204.123 |
| 89.83822982521386 | 13.345 | 49.663 | 197.297 | 204.204 |
| 90.00557828188919 | 13.313 | 51.424 | 197.604 | 204.89 |
| 90.16362960208257 | 13.692 | 52.273 | 197.636 | 205.197 |
| 90.3309780587579 | 13.83 | 52.426 | 195.487 | 203.17 |
| 90.49832651543326 | 13.684 | 52.895 | 192.838 | 200.69 |
| 90.66567497210859 | 13.442 | 52.741 | 189.59 | 197.45 |
| 90.83302342878395 | 13.078 | 52.45 | 186.787 | 194.623 |
| 91.00037188545929 | 12.65 | 52.563 | 184.275 | 192.224 |
| 91.16772034213463 | 12.06 | 51.958 | 182.668 | 190.471 |
| 91.33506879880998 | 11.6 | 51.247 | 181.125 | 188.766 |
| 91.50241725548533 | 10.978 | 50.059 | 179.477 | 186.804 |
| 91.66976571216065 | 10.291 | 48.662 | 177.942 | 184.889 |
| 91.83711416883601 | 9.629 | 47.329 | 176.544 | 183.144 |
| 92.00446262551137 | 9.023 | 46.877 | 175.317 | 181.811 |
| 92.1718110821867 | 8.417 | 46.101 | 173.297 | 179.622 |
| 92.33915953886203 | 7.763 | 44.914 | 170.478 | 176.561 |
| 92.49721085905541 | 7.052 | 43.452 | 167.012 | 172.804 |
| 92.66455931573077 | 6.317 | 41.892 | 164.161 | 169.654 |
| 92.83190777240611 | 5.655 | 40.212 | 162.788 | 167.933 |
| 92.99925622908145 | 5.089 | 38.815 | 161.713 | 166.576 |
| 93.1666046857568 | 4.669 | 37.724 | 160.8 | 165.453 |
| 93.33395314243214 | 4.435 | 36.933 | 159.912 | 164.395 |
| 93.50130159910749 | 4.104 | 36.278 | 158.829 | 163.183 |
| 93.66865005578283 | 3.74 | 35.64 | 157.674 | 161.899 |
| 93.83599851245818 | 3.369 | 35.002 | 156.519 | 160.615 |
| 94.00334696913353 | 3.312 | 35.228 | 154.136 | 158.337 |
| 94.17069542580886 | 3.312 | 34.986 | 150.404 | 154.653 |
| 94.3380438824842 | 3.191 | 34.299 | 146.155 | 150.356 |
| 94.50539233915954 | 2.989 | 33.499 | 144.095 | 148.166 |
| 94.66344365935292 | 2.9 | 33.201 | 143.005 | 147.036 |
| 94.83079211602828 | 2.868 | 33.249 | 142.552 | 146.599 |
| 94.99814057270362 | 2.843 | 33.354 | 141.438 | 145.525 |
| 95.16548902937897 | 2.924 | 33.419 | 140.807 | 144.919 |
| 95.33283748605432 | 2.916 | 33.402 | 140.194 | 144.338 |
| 95.50018594272963 | 2.973 | 33.58 | 139.596 | 143.796 |
| 95.66753439940499 | 3.126 | 33.79 | 139.127 | 143.409 |
| 95.83488285608034 | 3.062 | 33.758 | 137.746 | 142.068 |
| 96.00223131275567 | 3.029 | 33.685 | 137.318 | 141.623 |
| 96.16957976943102 | 2.94 | 33.225 | 135.969 | 140.194 |
| 96.33692822610638 | 2.916 | 32.554 | 135.524 | 139.604 |
| 96.50427668278171 | 2.843 | 32.764 | 137.213 | 141.3 |
| 96.67162513945706 | 2.811 | 32.999 | 137.52 | 141.656 |
| 96.8389735961324 | 3.199 | 33.718 | 136.365 | 140.694 |
| 96.99702491632577 | 3.877 | 34.743 | 134.773 | 139.386 |
| 97.16437337300111 | 4.176 | 34.937 | 132.673 | 137.39 |
| 97.33172182967647 | 4.071 | 34.558 | 131.429 | 136.074 |
| 97.49907028635181 | 3.829 | 33.919 | 130.944 | 135.452 |
| 97.66641874302715 | 3.506 | 32.772 | 130.645 | 134.894 |
| 97.8337671997025 | 3.029 | 31.658 | 132.301 | 136.251 |
| 98.00111565637785 | 2.545 | 30.939 | 134.337 | 138.085 |
| 98.16846411305319 | 2.254 | 30.414 | 136.639 | 140.25 |
| 98.33581256972855 | 2.052 | 30.171 | 138.473 | 142.003 |
| 98.50316102640389 | 1.826 | 30.276 | 140.5 | 143.998 |
| 98.67050948307921 | 1.608 | 30.179 | 140.977 | 144.426 |
| 98.83785793975456 | 1.567 | 30.179 | 141.615 | 145.032 |
| 99.0052063964299 | 1.543 | 30.187 | 142.278 | 145.67 |
| 99.17255485310525 | 1.527 | 30.228 | 142.577 | 145.977 |
| 99.33060617329863 | 1.478 | 30.074 | 141.72 | 145.121 |
| 99.49795462997399 | 1.397 | 29.541 | 139.903 | 143.263 |
| 99.66530308664933 | 1.26 | 28.976 | 138.594 | 141.914 |
| 99.83265154332467 | 0.889 | 28.338 | 139.475 | 142.754 |
| 100.0 | 0.525 | 27.691 | 140.347 | 143.586 |